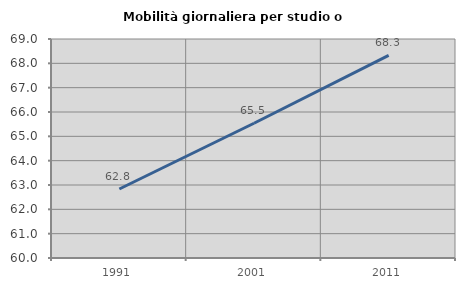
| Category | Mobilità giornaliera per studio o lavoro |
|---|---|
| 1991.0 | 62.835 |
| 2001.0 | 65.538 |
| 2011.0 | 68.326 |